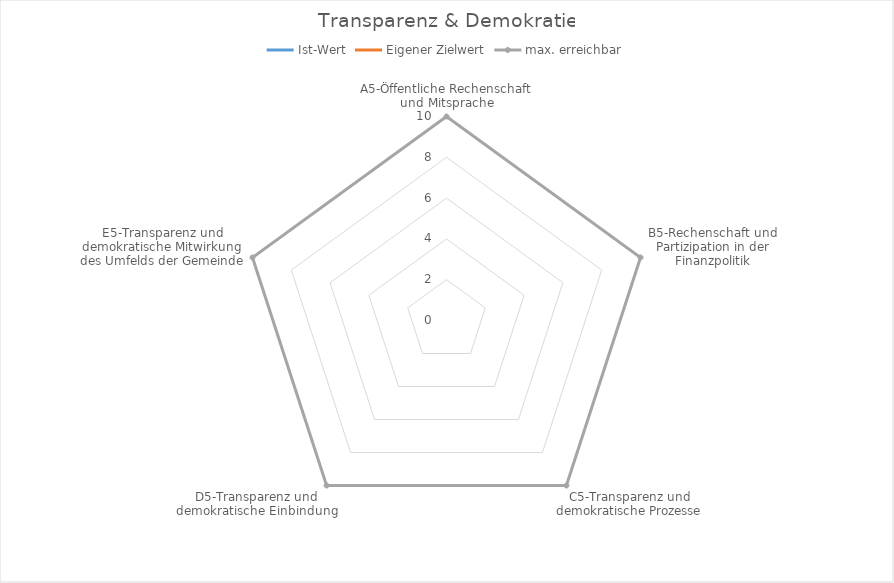
| Category | Ist-Wert | Eigener Zielwert | max. erreichbar |
|---|---|---|---|
| A5-Öffentliche Rechenschaft und Mitsprache | 0 | 0 | 10 |
| B5-Rechenschaft und Partizipation in der Finanzpolitik | 0 | 0 | 10 |
| C5-Transparenz und demokratische Prozesse | 0 | 0 | 10 |
| D5-Transparenz und demokratische Einbindung | 0 | 0 | 10 |
| E5-Transparenz und demokratische Mitwirkung des Umfelds der Gemeinde | 0 | 0 | 10 |